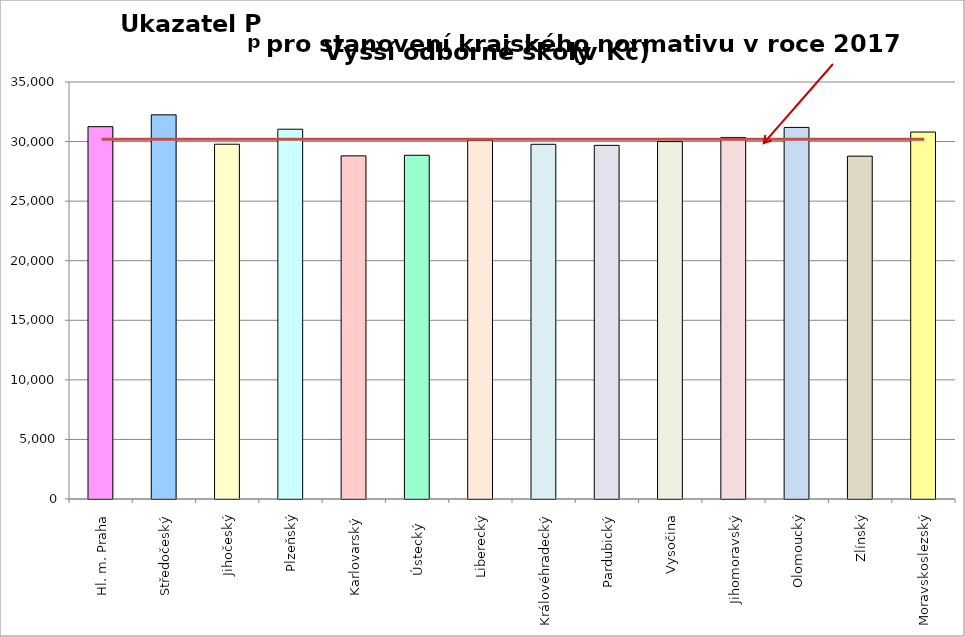
| Category | Series 0 |
|---|---|
| Hl. m. Praha | 31250 |
| Středočeský | 32242.32 |
| Jihočeský | 29778 |
| Plzeňský | 31037 |
| Karlovarský  | 28800 |
| Ústecký   | 28851 |
| Liberecký | 30080 |
| Královéhradecký | 29770 |
| Pardubický | 29683 |
| Vysočina | 29999 |
| Jihomoravský | 30346 |
| Olomoucký | 31188 |
| Zlínský | 28775 |
| Moravskoslezský | 30800 |